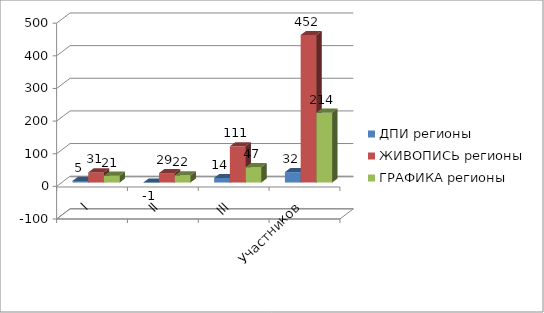
| Category | ДПИ регионы | ЖИВОПИСЬ регионы | ГРАФИКА регионы |
|---|---|---|---|
| I | 5 | 31 | 21 |
| II | -1 | 29 | 22 |
| III | 14 | 111 | 47 |
| Участников | 32 | 452 | 214 |